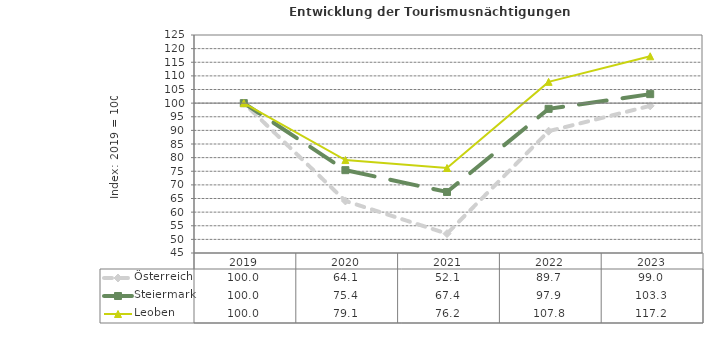
| Category | Österreich | Steiermark | Leoben |
|---|---|---|---|
| 2023.0 | 99 | 103.3 | 117.2 |
| 2022.0 | 89.7 | 97.9 | 107.8 |
| 2021.0 | 52.1 | 67.4 | 76.2 |
| 2020.0 | 64.1 | 75.4 | 79.1 |
| 2019.0 | 100 | 100 | 100 |